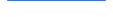
| Category | Series 0 |
|---|---|
| 0 | 27 |
| 1 | 17 |
| 2 | 32 |
| 3 | 31 |
| 4 | 29 |
| 5 | 29 |
| 6 | 35 |
| 7 | 22 |
| 8 | 21 |